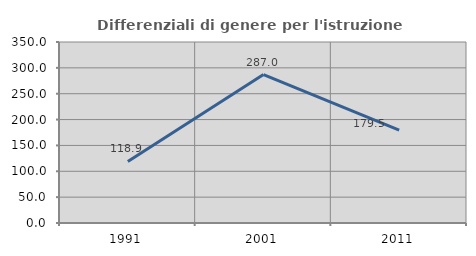
| Category | Differenziali di genere per l'istruzione superiore |
|---|---|
| 1991.0 | 118.929 |
| 2001.0 | 287 |
| 2011.0 | 179.487 |